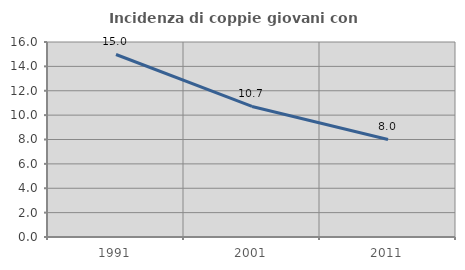
| Category | Incidenza di coppie giovani con figli |
|---|---|
| 1991.0 | 14.976 |
| 2001.0 | 10.714 |
| 2011.0 | 8.004 |